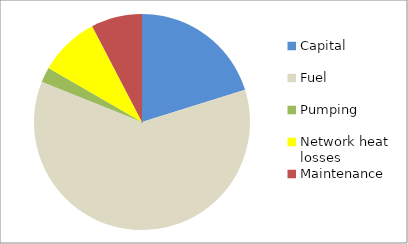
| Category | Series 0 |
|---|---|
| Capital | 0.202 |
| Fuel | 0.609 |
| Pumping | 0.023 |
| Network heat losses | 0.09 |
| Maintenance | 0.076 |